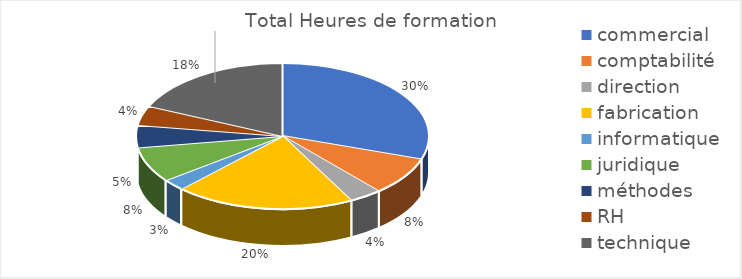
| Category | Total |
|---|---|
| commercial | 1575 |
| comptabilité | 441 |
| direction | 189 |
| fabrication | 1039.5 |
| informatique | 133 |
| juridique | 409.5 |
| méthodes | 255.5 |
| RH | 227.5 |
| technique | 952 |